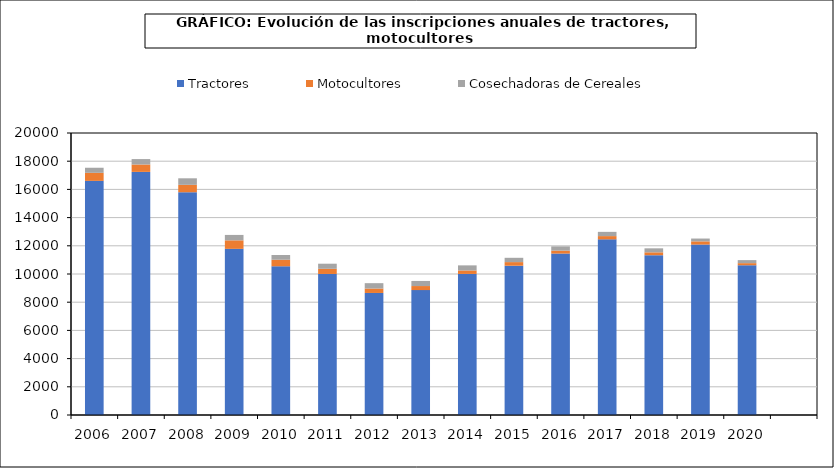
| Category | Tractores | Motocultores | Cosechadoras de Cereales |
|---|---|---|---|
| 2006.0 | 16605 | 570 | 361 |
| 2007.0 | 17241 | 525 | 385 |
| 2008.0 | 15799 | 525 | 463 |
| 2009.0 | 11784 | 603 | 384 |
| 2010.0 | 10548 | 463 | 336 |
| 2011.0 | 10002 | 366 | 362 |
| 2012.0 | 8655 | 315 | 380 |
| 2013.0 | 8859 | 287 | 361 |
| 2014.0 | 10004 | 248 | 360 |
| 2015.0 | 10587 | 257 | 305 |
| 2016.0 | 11449 | 209 | 302 |
| 2017.0 | 12457 | 231 | 301 |
| 2018.0 | 11333 | 204 | 284 |
| 2019.0 | 12087 | 228 | 200 |
| 2020.0 | 10620 | 150 | 215 |